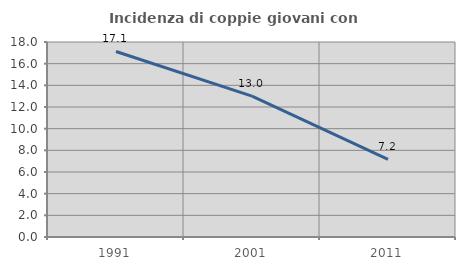
| Category | Incidenza di coppie giovani con figli |
|---|---|
| 1991.0 | 17.127 |
| 2001.0 | 13 |
| 2011.0 | 7.175 |